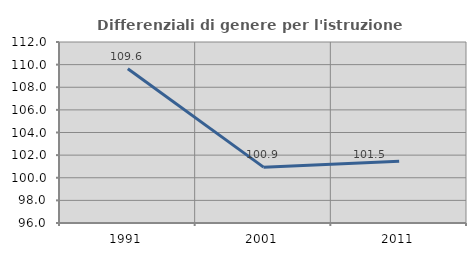
| Category | Differenziali di genere per l'istruzione superiore |
|---|---|
| 1991.0 | 109.628 |
| 2001.0 | 100.937 |
| 2011.0 | 101.455 |